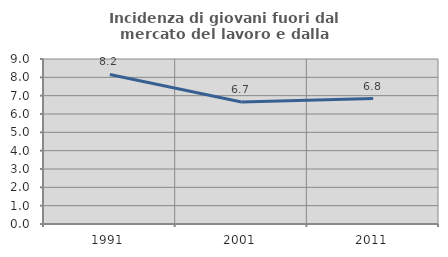
| Category | Incidenza di giovani fuori dal mercato del lavoro e dalla formazione  |
|---|---|
| 1991.0 | 8.159 |
| 2001.0 | 6.657 |
| 2011.0 | 6.842 |